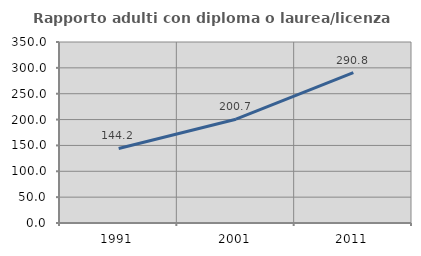
| Category | Rapporto adulti con diploma o laurea/licenza media  |
|---|---|
| 1991.0 | 144.171 |
| 2001.0 | 200.673 |
| 2011.0 | 290.781 |